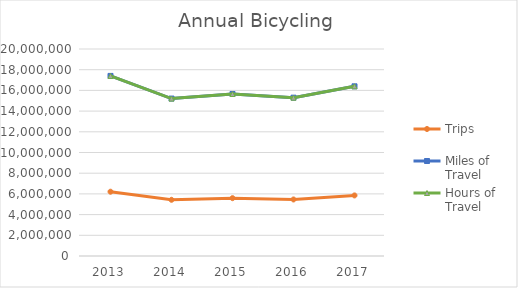
| Category | Trips | Miles of Travel | Hours of Travel |
|---|---|---|---|
| 2013 | 6212167.16 | 17400342.338 | 17400342.338 |
| 2014 | 5430275.164 | 15210255.038 | 15210255.038 |
| 2015 | 5588206.649 | 15652622.707 | 15652622.707 |
| 2016 | 5461526.364 | 15297789.962 | 15297789.962 |
| 2017 | 5852922.784 | 16394095.247 | 16394095.247 |